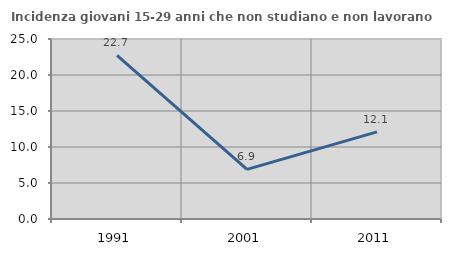
| Category | Incidenza giovani 15-29 anni che non studiano e non lavorano  |
|---|---|
| 1991.0 | 22.722 |
| 2001.0 | 6.897 |
| 2011.0 | 12.105 |